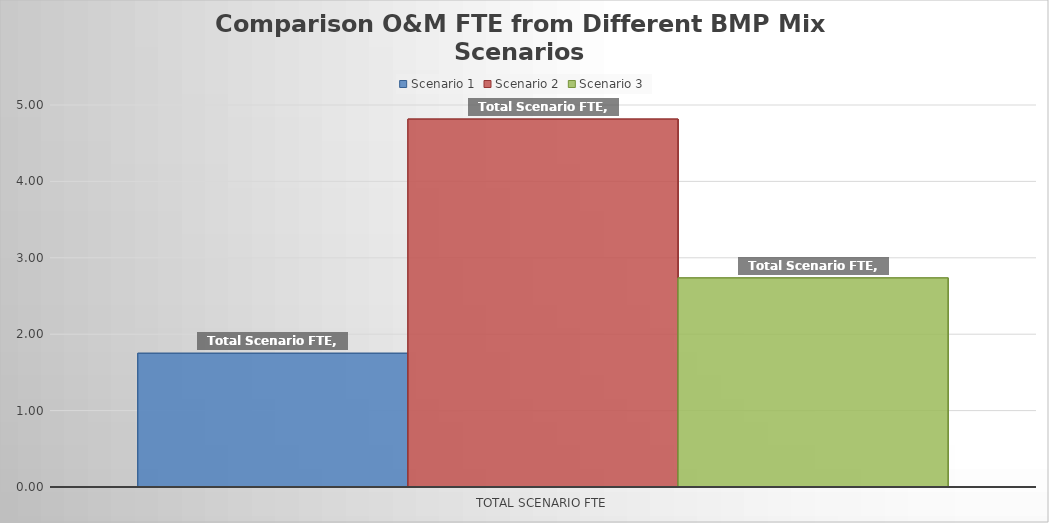
| Category | Scenario 1 | Scenario 2 | Scenario 3 |
|---|---|---|---|
| Total Scenario FTE | 1.75 | 4.815 | 2.736 |